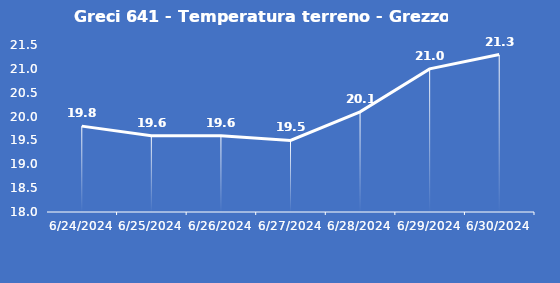
| Category | Greci 641 - Temperatura terreno - Grezzo (°C) |
|---|---|
| 6/24/24 | 19.8 |
| 6/25/24 | 19.6 |
| 6/26/24 | 19.6 |
| 6/27/24 | 19.5 |
| 6/28/24 | 20.1 |
| 6/29/24 | 21 |
| 6/30/24 | 21.3 |